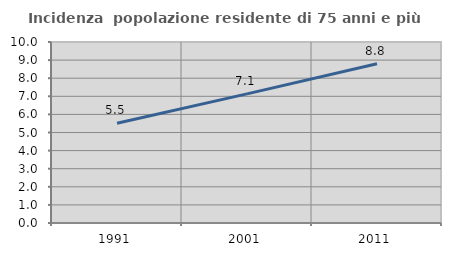
| Category | Incidenza  popolazione residente di 75 anni e più |
|---|---|
| 1991.0 | 5.51 |
| 2001.0 | 7.132 |
| 2011.0 | 8.797 |